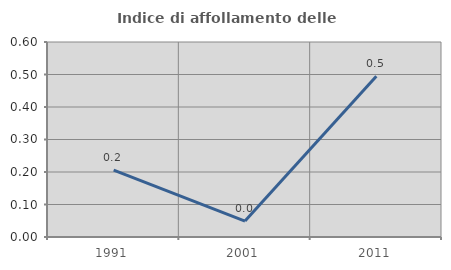
| Category | Indice di affollamento delle abitazioni  |
|---|---|
| 1991.0 | 0.206 |
| 2001.0 | 0.049 |
| 2011.0 | 0.494 |